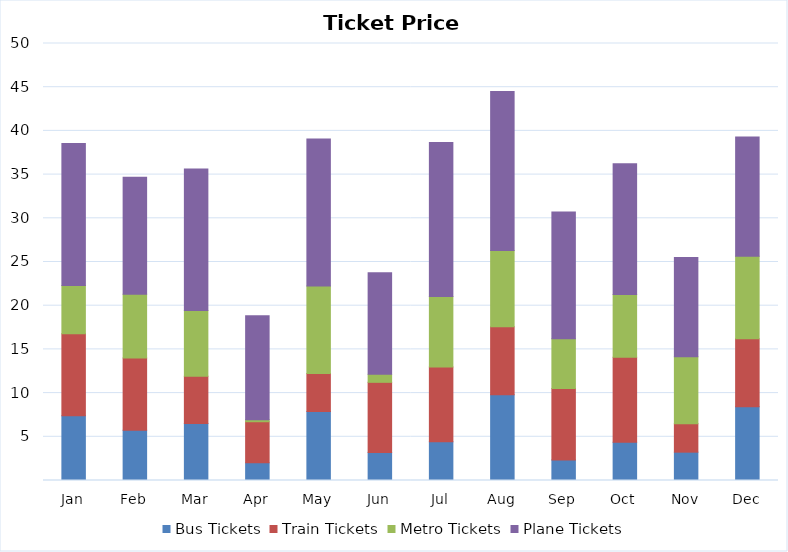
| Category | Bus Tickets | Train Tickets | Metro Tickets | Plane Tickets |
|---|---|---|---|---|
| Jan | 7.406 | 9.376 | 5.517 | 16.25 |
| Feb | 5.745 | 8.266 | 7.291 | 13.39 |
| Mar | 6.523 | 5.418 | 7.507 | 16.199 |
| Apr | 2.02 | 4.705 | 0.238 | 11.882 |
| May | 7.897 | 4.35 | 9.994 | 16.845 |
| Jun | 3.217 | 8.015 | 0.914 | 11.611 |
| Jul | 4.435 | 8.541 | 8.08 | 17.619 |
| Aug | 9.801 | 7.791 | 8.71 | 18.208 |
| Sep | 2.359 | 8.172 | 5.697 | 14.482 |
| Oct | 4.389 | 9.707 | 7.192 | 14.96 |
| Nov | 3.242 | 3.262 | 7.647 | 11.366 |
| Dec | 8.438 | 7.779 | 9.444 | 13.646 |